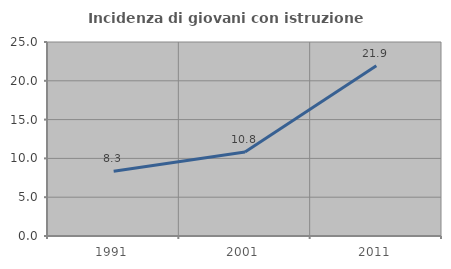
| Category | Incidenza di giovani con istruzione universitaria |
|---|---|
| 1991.0 | 8.333 |
| 2001.0 | 10.833 |
| 2011.0 | 21.93 |